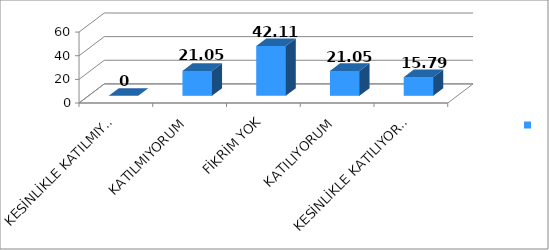
| Category | Series 0 |
|---|---|
| KESİNLİKLE KATILMIYORUM | 0 |
| KATILMIYORUM | 21.05 |
| FİKRİM YOK | 42.11 |
| KATILIYORUM | 21.05 |
| KESİNLİKLE KATILIYORUM | 15.79 |